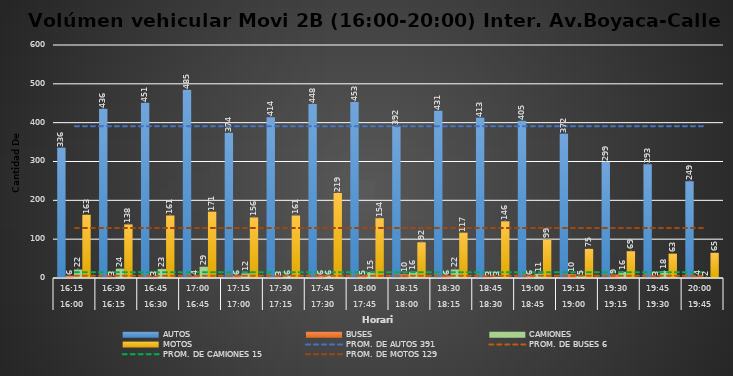
| Category | AUTOS | BUSES | CAMIONES | MOTOS |
|---|---|---|---|---|
| 0 | 336 | 6 | 22 | 163 |
| 1 | 436 | 3 | 24 | 138 |
| 2 | 451 | 3 | 23 | 161 |
| 3 | 485 | 4 | 29 | 171 |
| 4 | 374 | 6 | 12 | 156 |
| 5 | 414 | 3 | 6 | 161 |
| 6 | 448 | 6 | 6 | 219 |
| 7 | 453 | 5 | 15 | 154 |
| 8 | 392 | 10 | 16 | 92 |
| 9 | 431 | 6 | 22 | 117 |
| 10 | 413 | 3 | 3 | 146 |
| 11 | 405 | 6 | 11 | 99 |
| 12 | 372 | 10 | 5 | 75 |
| 13 | 299 | 9 | 16 | 69 |
| 14 | 293 | 3 | 18 | 63 |
| 15 | 249 | 4 | 2 | 65 |